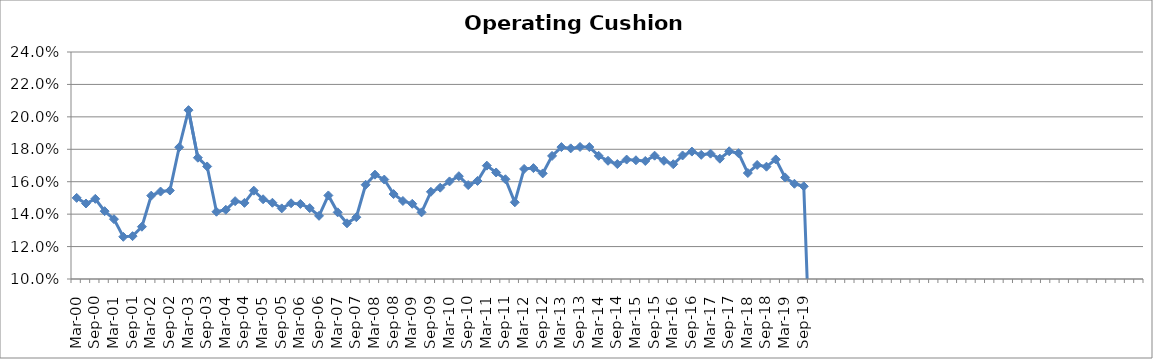
| Category | Operating Cushion % |
|---|---|
| Mar-00 | 0.15 |
| Jun-00 | 0.147 |
| Sep-00 | 0.149 |
| Dec-00 | 0.142 |
| Mar-01 | 0.137 |
| Jun-01 | 0.126 |
| Sep-01 | 0.126 |
| Dec-01 | 0.132 |
| Mar-02 | 0.151 |
| Jun-02 | 0.154 |
| Sep-02 | 0.155 |
| Dec-02 | 0.181 |
| Mar-03 | 0.204 |
| Jun-03 | 0.175 |
| Sep-03 | 0.169 |
| Dec-03 | 0.141 |
| Mar-04 | 0.143 |
| Jun-04 | 0.148 |
| Sep-04 | 0.147 |
| Dec-04 | 0.154 |
| Mar-05 | 0.149 |
| Jun-05 | 0.147 |
| Sep-05 | 0.144 |
| Dec-05 | 0.147 |
| Mar-06 | 0.146 |
| Jun-06 | 0.144 |
| Sep-06 | 0.139 |
| Dec-06 | 0.152 |
| Mar-07 | 0.141 |
| Jun-07 | 0.134 |
| Sep-07 | 0.138 |
| Dec-07 | 0.158 |
| Mar-08 | 0.164 |
| Jun-08 | 0.161 |
| Sep-08 | 0.152 |
| Dec-08 | 0.148 |
| Mar-09 | 0.146 |
| Jun-09 | 0.141 |
| Sep-09 | 0.154 |
| Dec-09 | 0.156 |
| Mar-10 | 0.16 |
| Jun-10 | 0.163 |
| Sep-10 | 0.158 |
| Dec-10 | 0.16 |
| Mar-11 | 0.17 |
| Jun-11 | 0.166 |
| Sep-11 | 0.162 |
| Dec-11 | 0.147 |
| Mar-12 | 0.168 |
| Jun-12 | 0.168 |
| Sep-12 | 0.165 |
| Dec-12 | 0.176 |
| Mar-13 | 0.181 |
| Jun-13 | 0.181 |
| Sep-13 | 0.181 |
| Dec-13 | 0.181 |
| Mar-14 | 0.176 |
| Jun-14 | 0.173 |
| Sep-14 | 0.171 |
| Dec-14 | 0.174 |
| Mar-15 | 0.173 |
| Jun-15 | 0.173 |
| Sep-15 | 0.176 |
| Dec-15 | 0.173 |
| Mar-16 | 0.171 |
| Jun-16 | 0.176 |
| Sep-16 | 0.179 |
| Dec-16 | 0.177 |
| Mar-17 | 0.177 |
| Jun-17 | 0.174 |
| Sep-17 | 0.179 |
| Dec-17 | 0.178 |
| Mar-18 | 0.165 |
| Jun-18 | 0.17 |
| Sep-18 | 0.169 |
| Dec-18 | 0.174 |
| Mar-19 | 0.163 |
| Jun-19 | 0.159 |
| Sep-19 | 0.157 |